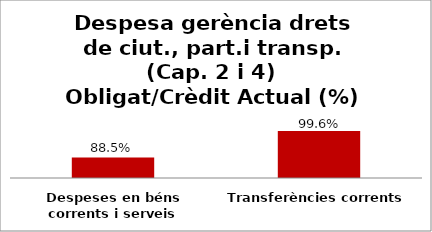
| Category | Series 0 |
|---|---|
| Despeses en béns corrents i serveis | 0.885 |
| Transferències corrents | 0.996 |